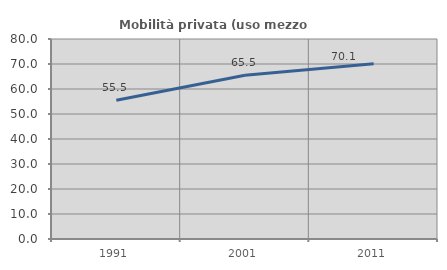
| Category | Mobilità privata (uso mezzo privato) |
|---|---|
| 1991.0 | 55.496 |
| 2001.0 | 65.501 |
| 2011.0 | 70.099 |